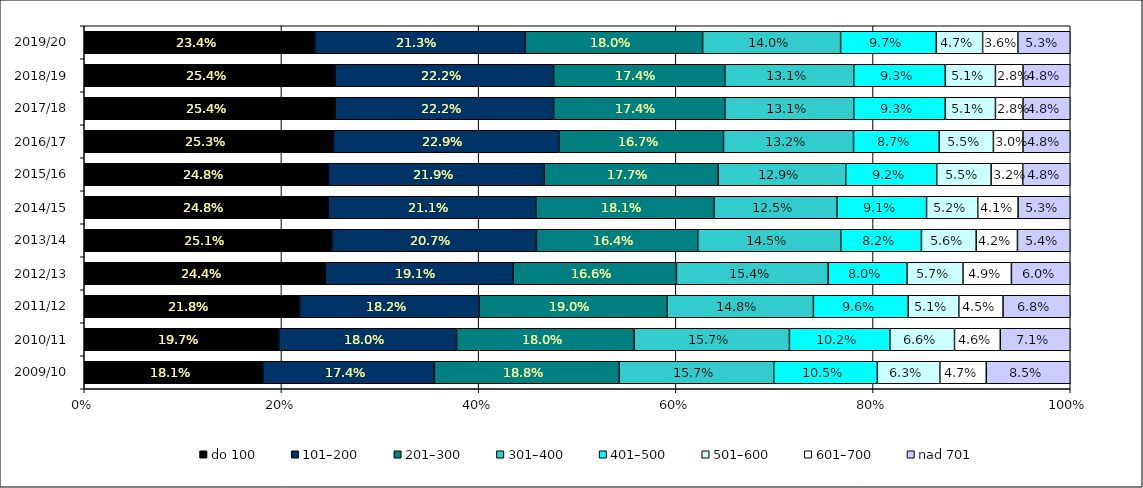
| Category | do 100 | 101–200 | 201–300 | 301–400 | 401–500 | 501–600 | 601–700 | nad 701  |
|---|---|---|---|---|---|---|---|---|
| 2009/10 | 0.181 | 0.174 | 0.188 | 0.157 | 0.105 | 0.063 | 0.047 | 0.085 |
| 2010/11 | 0.197 | 0.18 | 0.18 | 0.157 | 0.102 | 0.066 | 0.046 | 0.071 |
| 2011/12 | 0.218 | 0.182 | 0.19 | 0.148 | 0.096 | 0.051 | 0.045 | 0.068 |
| 2012/13 | 0.244 | 0.191 | 0.166 | 0.154 | 0.08 | 0.057 | 0.049 | 0.06 |
| 2013/14 | 0.251 | 0.207 | 0.164 | 0.145 | 0.082 | 0.056 | 0.042 | 0.054 |
| 2014/15 | 0.248 | 0.211 | 0.181 | 0.125 | 0.091 | 0.052 | 0.041 | 0.053 |
| 2015/16 | 0.248 | 0.219 | 0.177 | 0.129 | 0.092 | 0.055 | 0.032 | 0.048 |
| 2016/17 | 0.253 | 0.229 | 0.167 | 0.132 | 0.087 | 0.055 | 0.03 | 0.048 |
| 2017/18 | 0.254 | 0.222 | 0.174 | 0.131 | 0.093 | 0.051 | 0.028 | 0.048 |
| 2018/19 | 0.254 | 0.222 | 0.174 | 0.131 | 0.093 | 0.051 | 0.028 | 0.048 |
| 2019/20 | 0.234 | 0.213 | 0.18 | 0.14 | 0.097 | 0.047 | 0.036 | 0.053 |